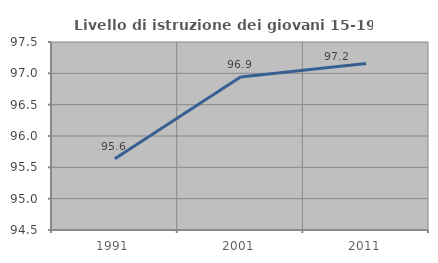
| Category | Livello di istruzione dei giovani 15-19 anni |
|---|---|
| 1991.0 | 95.638 |
| 2001.0 | 96.94 |
| 2011.0 | 97.157 |